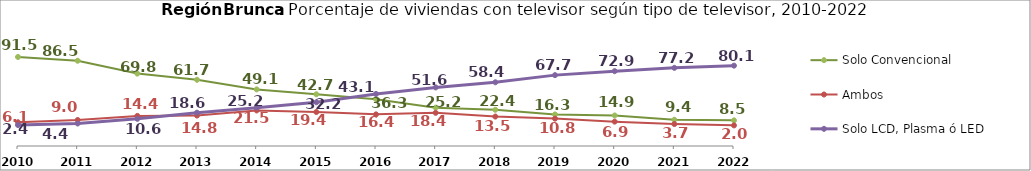
| Category | Solo Convencional | Ambos | Solo LCD, Plasma ó LED |
|---|---|---|---|
| 2010.0 | 91.483 | 6.078 | 2.439 |
| 2011.0 | 86.546 | 9.016 | 4.437 |
| 2012.0 | 69.762 | 14.409 | 10.569 |
| 2013.0 | 61.653 | 14.835 | 18.622 |
| 2014.0 | 49.061 | 21.509 | 25.2 |
| 2015.0 | 42.664 | 19.449 | 32.217 |
| 2016.0 | 36.285 | 16.383 | 43.094 |
| 2017.0 | 25.197 | 18.42 | 51.641 |
| 2018.0 | 22.406 | 13.53 | 58.37 |
| 2019.0 | 16.307 | 10.833 | 67.737 |
| 2020.0 | 14.945 | 6.864 | 72.898 |
| 2021.0 | 9.368 | 3.664 | 77.243 |
| 2022.0 | 8.52 | 1.973 | 80.132 |